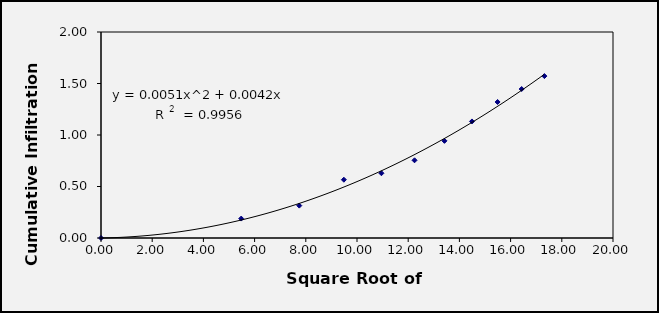
| Category | Series 0 |
|---|---|
| 0.0 | 0 |
| 5.477225575051661 | 0.189 |
| 7.745966692414834 | 0.314 |
| 9.486832980505138 | 0.566 |
| 10.954451150103322 | 0.629 |
| 12.24744871391589 | 0.755 |
| 13.416407864998739 | 0.943 |
| 14.491376746189438 | 1.132 |
| 15.491933384829668 | 1.32 |
| 16.431676725154983 | 1.446 |
| 17.320508075688775 | 1.572 |